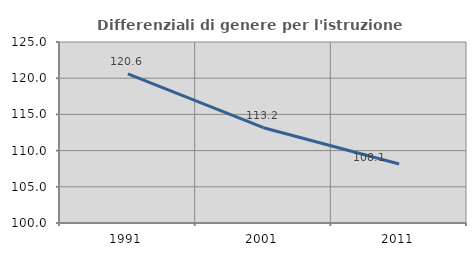
| Category | Differenziali di genere per l'istruzione superiore |
|---|---|
| 1991.0 | 120.601 |
| 2001.0 | 113.166 |
| 2011.0 | 108.139 |